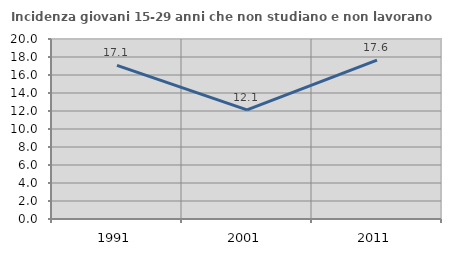
| Category | Incidenza giovani 15-29 anni che non studiano e non lavorano  |
|---|---|
| 1991.0 | 17.073 |
| 2001.0 | 12.121 |
| 2011.0 | 17.647 |